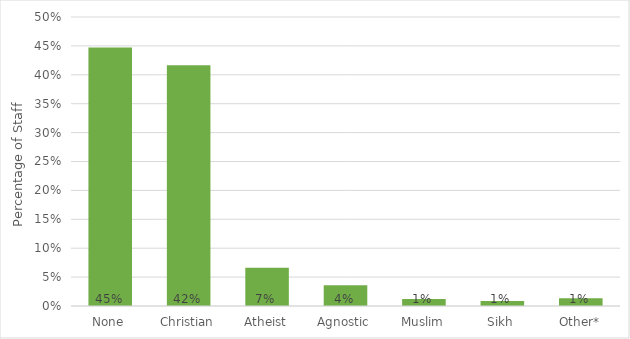
| Category | % of Staff |
|---|---|
| None | 0.447 |
| Christian | 0.417 |
| Atheist | 0.066 |
| Agnostic | 0.036 |
| Muslim | 0.012 |
| Sikh | 0.009 |
| Other* | 0.014 |